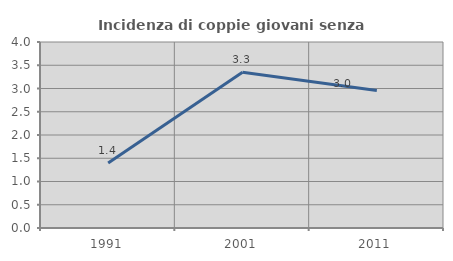
| Category | Incidenza di coppie giovani senza figli |
|---|---|
| 1991.0 | 1.395 |
| 2001.0 | 3.349 |
| 2011.0 | 2.956 |